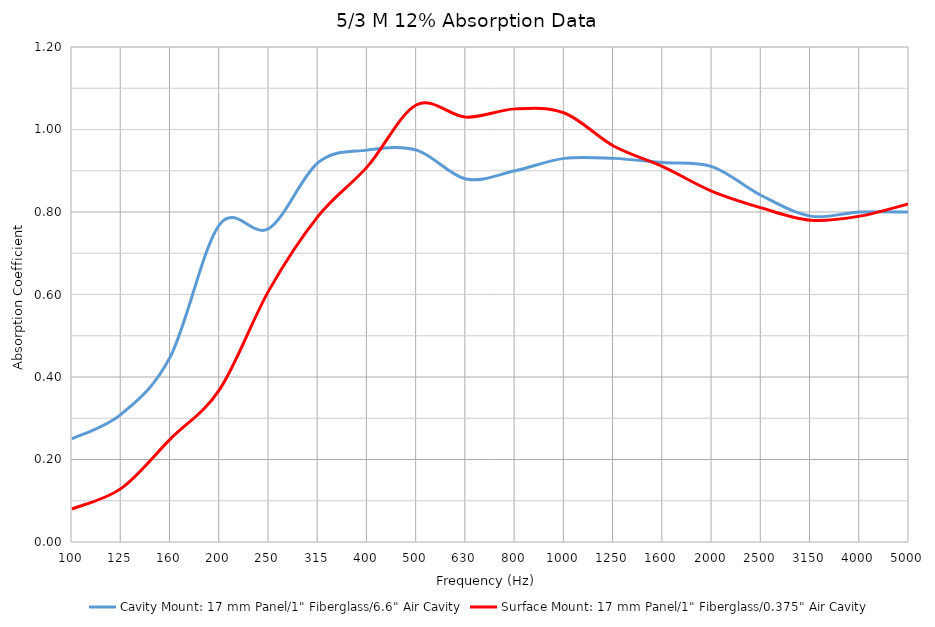
| Category | Cavity Mount: 17 mm Panel/1" Fiberglass/6.6" Air Cavity | Surface Mount: 17 mm Panel/1" Fiberglass/0.375" Air Cavity |
|---|---|---|
| 100.0 | 0.25 | 0.08 |
| 125.0 | 0.31 | 0.13 |
| 160.0 | 0.45 | 0.25 |
| 200.0 | 0.77 | 0.37 |
| 250.0 | 0.76 | 0.61 |
| 315.0 | 0.92 | 0.79 |
| 400.0 | 0.95 | 0.91 |
| 500.0 | 0.95 | 1.06 |
| 630.0 | 0.88 | 1.03 |
| 800.0 | 0.9 | 1.05 |
| 1000.0 | 0.93 | 1.04 |
| 1250.0 | 0.93 | 0.96 |
| 1600.0 | 0.92 | 0.91 |
| 2000.0 | 0.91 | 0.85 |
| 2500.0 | 0.84 | 0.81 |
| 3150.0 | 0.79 | 0.78 |
| 4000.0 | 0.8 | 0.79 |
| 5000.0 | 0.8 | 0.82 |